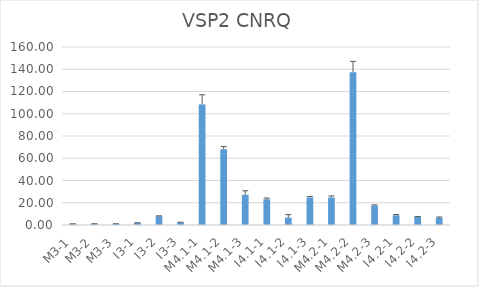
| Category | VSP2 CNRQ |
|---|---|
| M3-1 | 1 |
| M3-2 | 1 |
| M3-3 | 1 |
| I3-1 | 1.95 |
| I3-2 | 7.759 |
| I3-3 | 2.34 |
| M4.1-1 | 108.4 |
| M4.1-2 | 68.11 |
| M4.1-3 | 27.07 |
| I4.1-1 | 23.17 |
| I4.1-2 | 6.608 |
| I4.1-3 | 24.66 |
| M4.2-1 | 24.65 |
| M4.2-2 | 137.3 |
| M4.2-3 | 17.44 |
| I4.2-1 | 8.707 |
| I4.2-2 | 7.382 |
| I4.2-3 | 6.38 |